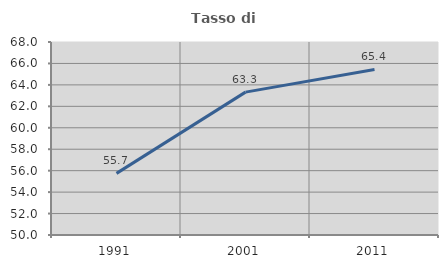
| Category | Tasso di occupazione   |
|---|---|
| 1991.0 | 55.748 |
| 2001.0 | 63.326 |
| 2011.0 | 65.436 |